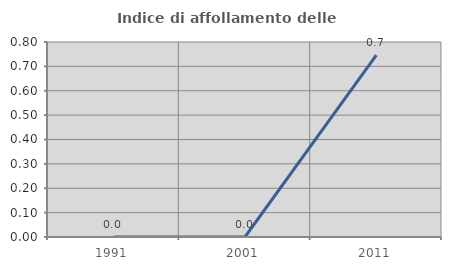
| Category | Indice di affollamento delle abitazioni  |
|---|---|
| 1991.0 | 0 |
| 2001.0 | 0 |
| 2011.0 | 0.746 |